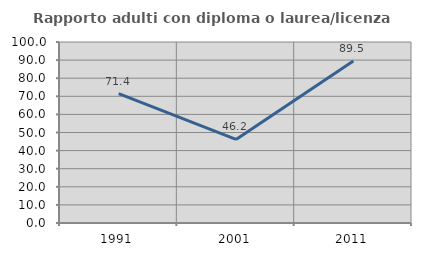
| Category | Rapporto adulti con diploma o laurea/licenza media  |
|---|---|
| 1991.0 | 71.429 |
| 2001.0 | 46.154 |
| 2011.0 | 89.474 |